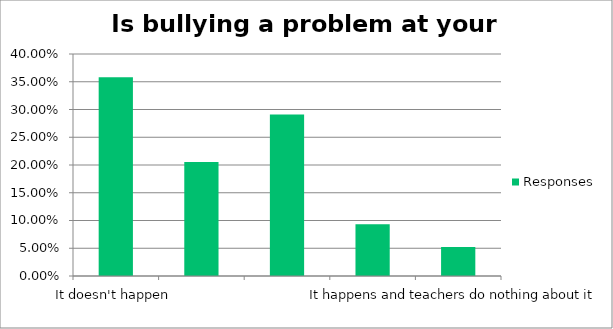
| Category | Responses |
|---|---|
| It doesn't happen | 0.358 |
| It happens and teachers are really good at resolving it | 0.205 |
| It happens and teachers are good at resolving it | 0.291 |
| It happens and teachers are not good at resolving it | 0.093 |
| It happens and teachers do nothing about it | 0.052 |